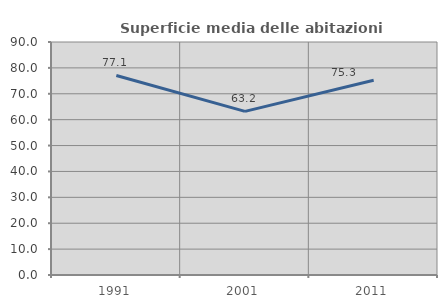
| Category | Superficie media delle abitazioni occupate |
|---|---|
| 1991.0 | 77.066 |
| 2001.0 | 63.203 |
| 2011.0 | 75.256 |